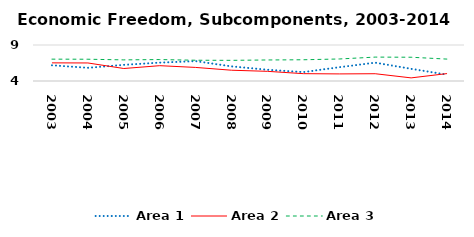
| Category | Area 1 | Area 2 | Area 3 |
|---|---|---|---|
| 2003.0 | 6.182 | 6.518 | 7.034 |
| 2004.0 | 5.833 | 6.505 | 7.024 |
| 2005.0 | 6.242 | 5.736 | 6.934 |
| 2006.0 | 6.551 | 6.127 | 6.978 |
| 2007.0 | 6.761 | 5.885 | 6.884 |
| 2008.0 | 6.03 | 5.497 | 6.869 |
| 2009.0 | 5.56 | 5.343 | 6.921 |
| 2010.0 | 5.236 | 5.018 | 6.95 |
| 2011.0 | 5.915 | 4.983 | 7.058 |
| 2012.0 | 6.549 | 5.009 | 7.319 |
| 2013.0 | 5.693 | 4.433 | 7.3 |
| 2014.0 | 4.877 | 5.03 | 7.042 |